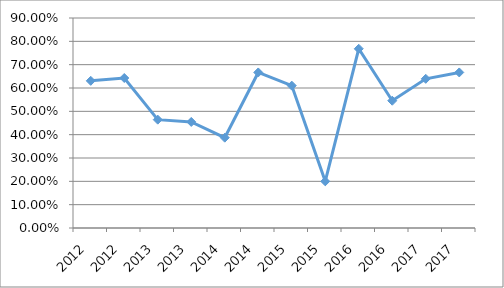
| Category | INCO-I1O01 |
|---|---|
| 2012.0 | 0.631 |
| 2012.0 | 0.643 |
| 2013.0 | 0.464 |
| 2013.0 | 0.455 |
| 2014.0 | 0.387 |
| 2014.0 | 0.667 |
| 2015.0 | 0.61 |
| 2015.0 | 0.2 |
| 2016.0 | 0.768 |
| 2016.0 | 0.545 |
| 2017.0 | 0.639 |
| 2017.0 | 0.667 |